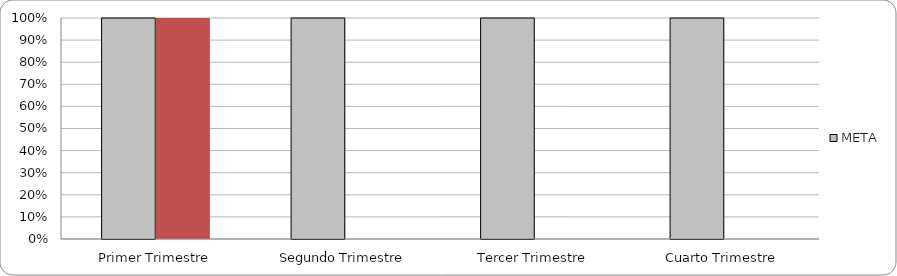
| Category | META | 100% |
|---|---|---|
| Primer Trimestre | 1 | 1 |
| Segundo Trimestre | 1 | 0 |
| Tercer Trimestre | 1 | 0 |
| Cuarto Trimestre | 1 | 0 |